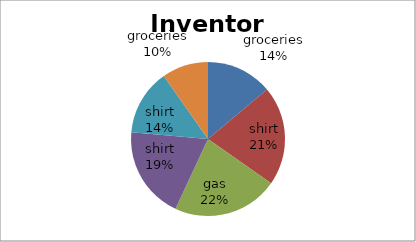
| Category | Day 1 |
|---|---|
| groceries | 50 |
| shirt | 75 |
| gas | 80 |
| shirt | 70 |
| shirt | 50 |
| groceries | 35 |